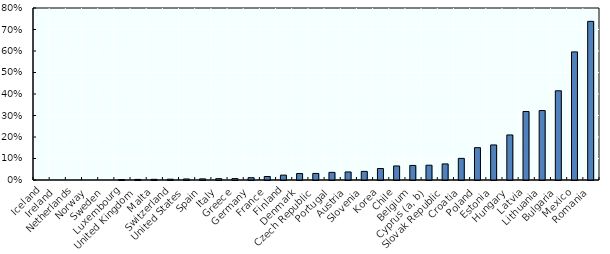
| Category | Series 0 |
|---|---|
| Iceland | 0 |
| Ireland | 0 |
| Netherlands | 0 |
| Norway | 0 |
| Sweden | 0 |
| Luxembourg | 0.002 |
| United Kingdom | 0.003 |
| Malta | 0.003 |
| Switzerland | 0.004 |
| United States | 0.005 |
| Spain | 0.005 |
| Italy | 0.006 |
| Greece | 0.006 |
| Germany | 0.011 |
| France | 0.016 |
| Finland | 0.023 |
| Denmark | 0.03 |
| Czech Republic | 0.031 |
| Portugal | 0.036 |
| Austria | 0.037 |
| Slovenia | 0.04 |
| Korea | 0.053 |
| Chile | 0.065 |
| Belgium | 0.068 |
| Cyprus (a, b) | 0.069 |
| Slovak Republic | 0.075 |
| Croatia | 0.101 |
| Poland | 0.15 |
| Estonia | 0.163 |
| Hungary | 0.21 |
| Latvia | 0.319 |
| Lithuania | 0.323 |
| Bulgaria | 0.415 |
| Mexico | 0.596 |
| Romania | 0.738 |